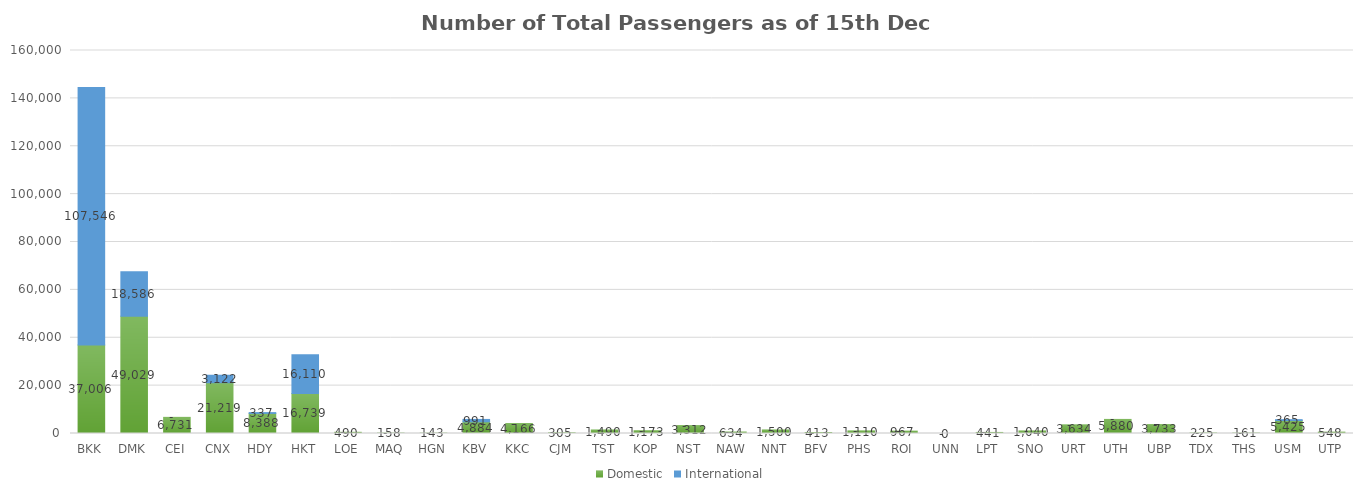
| Category | Domestic | International |
|---|---|---|
| BKK | 37006 | 107546 |
| DMK | 49029 | 18586 |
| CEI | 6731 | 0 |
| CNX | 21219 | 3122 |
| HDY | 8388 | 337 |
| HKT | 16739 | 16110 |
| LOE | 490 | 0 |
| MAQ | 158 | 0 |
| HGN | 143 | 0 |
| KBV | 4884 | 991 |
| KKC | 4166 | 0 |
| CJM | 305 | 0 |
| TST | 1490 | 0 |
| KOP | 1173 | 0 |
| NST | 3312 | 0 |
| NAW | 634 | 0 |
| NNT | 1500 | 0 |
| BFV | 413 | 0 |
| PHS | 1110 | 0 |
| ROI | 967 | 0 |
| UNN | 0 | 0 |
| LPT | 441 | 0 |
| SNO | 1040 | 0 |
| URT | 3634 | 0 |
| UTH | 5880 | 0 |
| UBP | 3733 | 0 |
| TDX | 225 | 0 |
| THS | 161 | 0 |
| USM | 5425 | 365 |
| UTP | 548 | 0 |